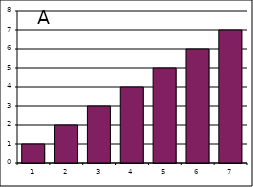
| Category | A |
|---|---|
| 1.0 | 1 |
| 2.0 | 2 |
| 3.0 | 3 |
| 4.0 | 4 |
| 5.0 | 5 |
| 6.0 | 6 |
| 7.0 | 7 |